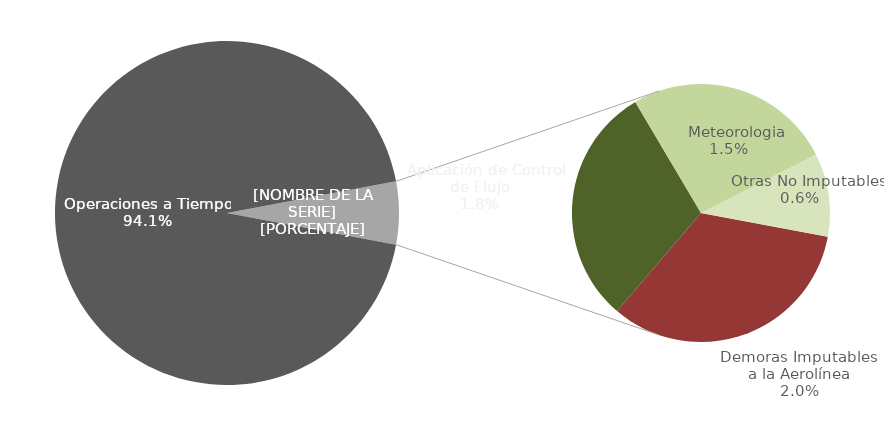
| Category | Demoras |
|---|---|
| Operaciones a Tiempo | 1534 |
| Demoras Imputables 
a la Aerolínea | 32 |
|    Aplicación de Control 
de Flujo | 29 |
|    Repercusiones por un 
Tercero | 0 |
|    Meteorologia | 25 |
|    Otras No Imputables | 10 |